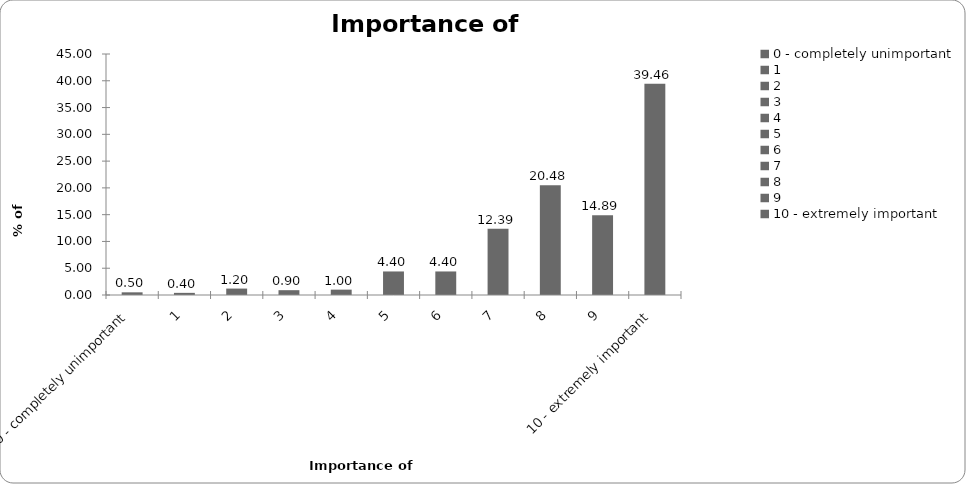
| Category | Importance of insurance |
|---|---|
| 0 - completely unimportant | 0.5 |
| 1 | 0.4 |
| 2 | 1.199 |
| 3 | 0.899 |
| 4 | 0.999 |
| 5 | 4.396 |
| 6 | 4.396 |
| 7 | 12.388 |
| 8 | 20.48 |
| 9 | 14.885 |
| 10 - extremely important | 39.461 |